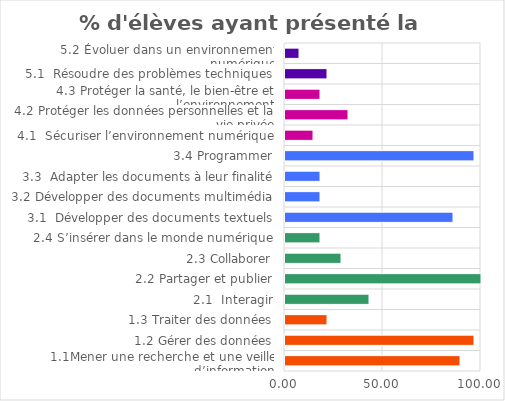
| Category | Series 0 |
|---|---|
| 1.1Mener une recherche et une veille d’information | 89.286 |
| 1.2 Gérer des données | 96.429 |
| 1.3 Traiter des données | 21.429 |
| 2.1  Interagir | 42.857 |
| 2.2 Partager et publier | 100 |
| 2.3 Collaborer | 28.571 |
| 2.4 S’insérer dans le monde numérique | 17.857 |
| 3.1  Développer des documents textuels | 85.714 |
| 3.2 Développer des documents multimédia | 17.857 |
| 3.3  Adapter les documents à leur finalité | 17.857 |
| 3.4 Programmer | 96.429 |
| 4.1  Sécuriser l’environnement numérique | 14.286 |
| 4.2 Protéger les données personnelles et la vie privée | 32.143 |
| 4.3 Protéger la santé, le bien-être et l’environnement | 17.857 |
| 5.1  Résoudre des problèmes techniques | 21.429 |
| 5.2 Évoluer dans un environnement numérique | 7.143 |